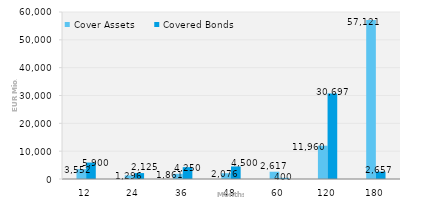
| Category | Cover Assets | Covered Bonds |
|---|---|---|
| 12.0 | 3552.11 | 5900 |
| 24.0 | 1296.4 | 2125 |
| 36.0 | 1861.16 | 4250 |
| 48.0 | 2076.4 | 4500 |
| 60.0 | 2617.1 | 400 |
| 120.0 | 11960.1 | 30697.2 |
| 180.0 | 57121.28 | 2657 |